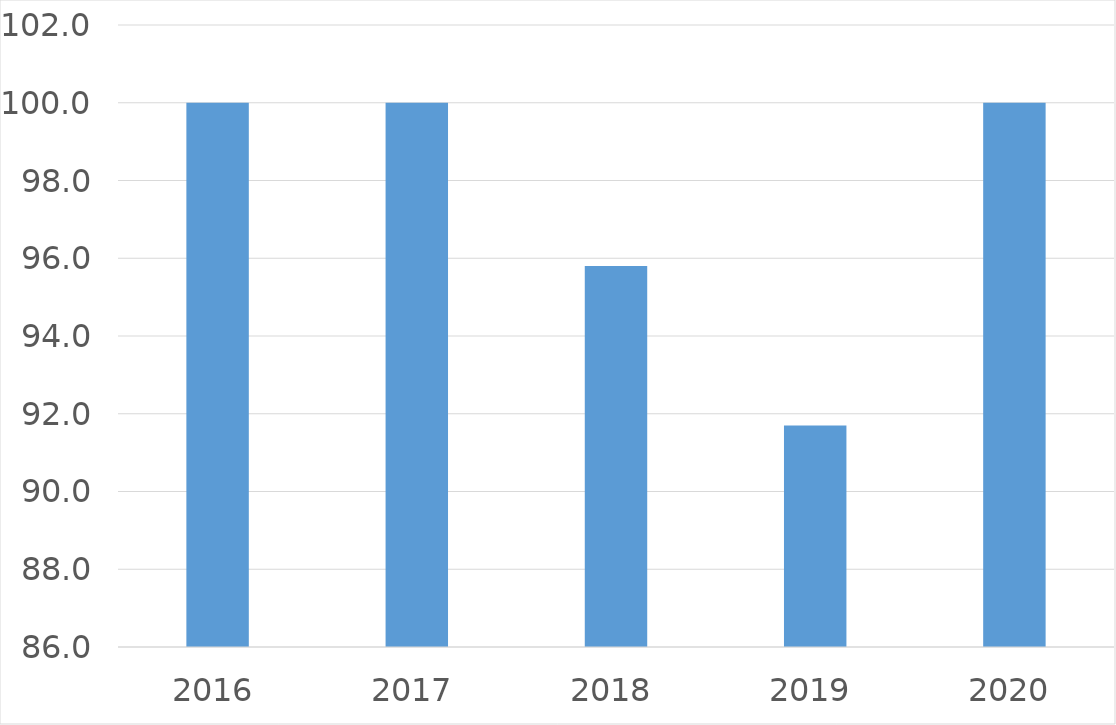
| Category | Series 0 |
|---|---|
| 2016 | 100 |
| 2017 | 100 |
| 2018 | 95.8 |
| 2019 | 91.7 |
| 2020 | 100 |